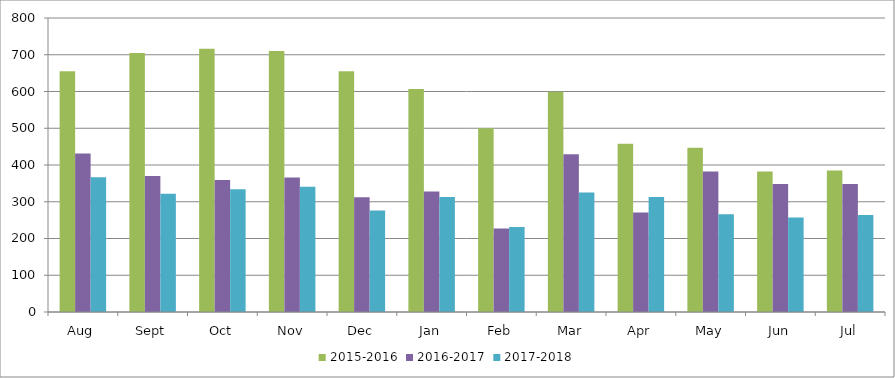
| Category | 2015-2016 | 2016-2017 | 2017-2018 |
|---|---|---|---|
| Aug | 655 | 431 | 367 |
| Sept | 705 | 370 | 322 |
| Oct | 716 | 359 | 334 |
| Nov | 710 | 366 | 341 |
| Dec | 655 | 312 | 276 |
| Jan | 607 | 328 | 313 |
| Feb | 500 | 227 | 231 |
| Mar | 599 | 429 | 325 |
| Apr | 458 | 271 | 313 |
| May | 447 | 382 | 266 |
| Jun | 382 | 348 | 257 |
| Jul | 385 | 348 | 264 |